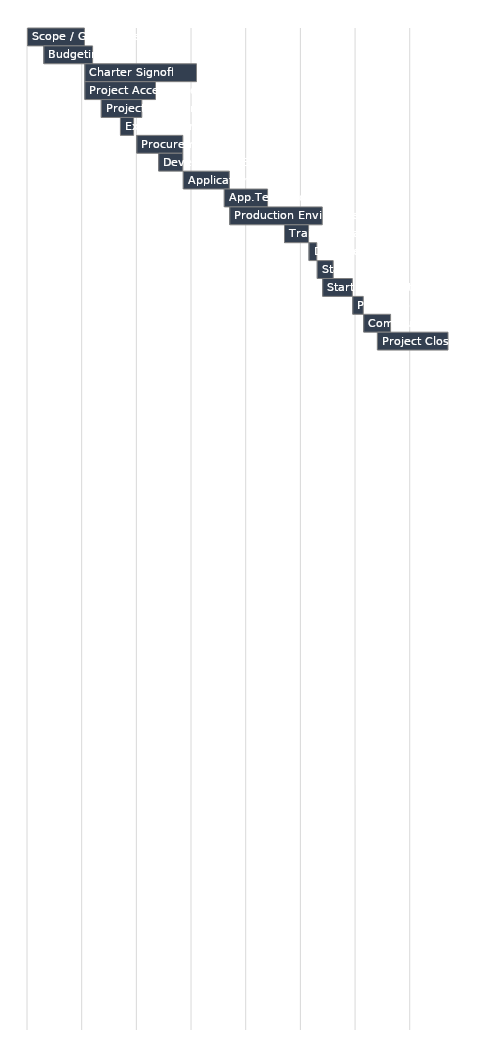
| Category | Blank | Age |
|---|---|---|
| Scope / Goal Review | 2014-07-30 | 21 |
| Budgeting | 2014-08-05 | 18 |
| Charter Signoff | 2014-08-20 | 41 |
| Project Acceptance | 2014-08-20 | 26 |
| Project Initiation | 2014-08-26 | 15 |
| Execute Contracts | 2014-09-02 | 5 |
| Procurements | 2014-09-08 | 17 |
| Development Env. | 2014-09-16 | 9 |
| Application Build | 2014-09-25 | 17 |
| App.Test / Acceptance | 2014-10-10 | 16 |
| Production Environment | 2014-10-12 | 34 |
| Training Phase | 2014-11-01 | 9 |
| Documentation | 2014-11-10 | 3 |
| Stage Roll | 2014-11-13 | 6 |
| Start / No Start | 2014-11-15 | 11 |
| Production Roll | 2014-11-26 | 4 |
| Communication | 2014-11-30 | 10 |
| Project Closing | 2014-12-05 | 26 |